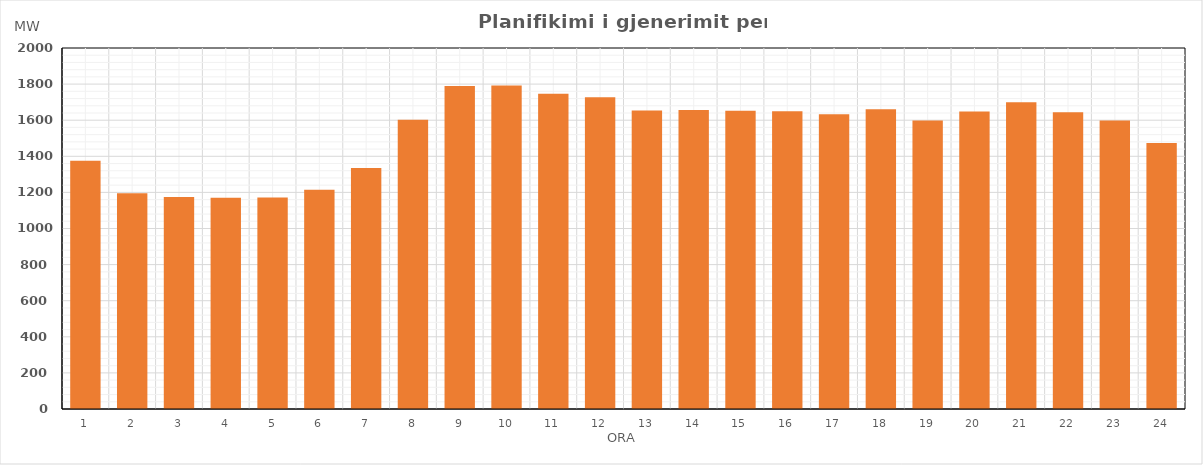
| Category | Max (MW) |
|---|---|
| 0 | 1374.98 |
| 1 | 1195.98 |
| 2 | 1174.68 |
| 3 | 1170.48 |
| 4 | 1172.17 |
| 5 | 1214.29 |
| 6 | 1334.5 |
| 7 | 1603.15 |
| 8 | 1789.51 |
| 9 | 1791.69 |
| 10 | 1746.25 |
| 11 | 1727.29 |
| 12 | 1653.95 |
| 13 | 1656.74 |
| 14 | 1651.93 |
| 15 | 1648.91 |
| 16 | 1632.33 |
| 17 | 1660.02 |
| 18 | 1598.09 |
| 19 | 1647.93 |
| 20 | 1700.1 |
| 21 | 1644.13 |
| 22 | 1598.9 |
| 23 | 1473.4 |